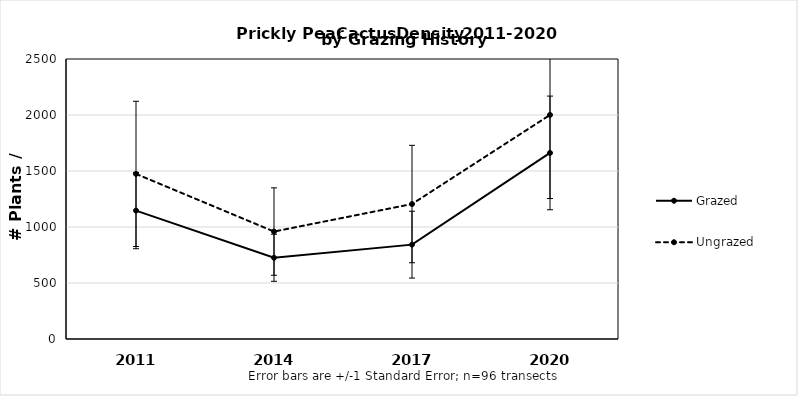
| Category | Grazed | Ungrazed |
|---|---|---|
| 2011.0 | 1146.589 | 1474.186 |
| 2014.0 | 725.393 | 959.391 |
| 2017.0 | 842.392 | 1205.089 |
| 2020.0 | 1661.385 | 2000.681 |